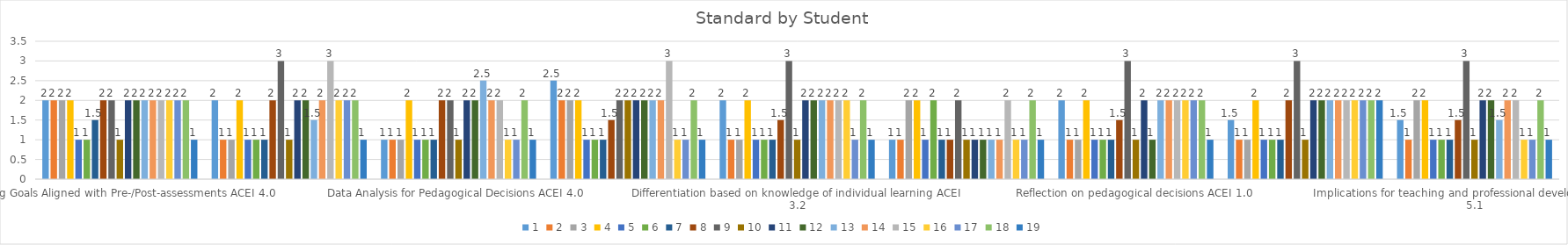
| Category | 1 | 2 | 3 | 4 | 5 | 6 | 7 | 8 | 9 | 10 | 11 | 12 | 13 | 14 | 15 | 16 | 17 | 18 | 19 |
|---|---|---|---|---|---|---|---|---|---|---|---|---|---|---|---|---|---|---|---|
| Learning Goals Aligned with Pre-/Post-assessments ACEI 4.0 | 2 | 2 | 2 | 2 | 1 | 1 | 1.5 | 2 | 2 | 1 | 2 | 2 | 2 | 2 | 2 | 2 | 2 | 2 | 1 |
| Data Points | 2 | 1 | 1 | 2 | 1 | 1 | 1 | 2 | 3 | 1 | 2 | 2 | 1.5 | 2 | 3 | 2 | 2 | 2 | 1 |
| Data Analysis for Pedagogical Decisions ACEI 4.0 | 1 | 1 | 1 | 2 | 1 | 1 | 1 | 2 | 2 | 1 | 2 | 2 | 2.5 | 2 | 2 | 1 | 1 | 2 | 1 |
| Integrated Instruction ACEI 3.1 | 2.5 | 2 | 2 | 2 | 1 | 1 | 1 | 1.5 | 2 | 2 | 2 | 2 | 2 | 2 | 3 | 1 | 1 | 2 | 1 |
| Differentiation based on knowledge of individual learning ACEI 3.2 | 2 | 1 | 1 | 2 | 1 | 1 | 1 | 1.5 | 3 | 1 | 2 | 2 | 2 | 2 | 2 | 2 | 1 | 2 | 1 |
| Technology integration | 1 | 1 | 2 | 2 | 1 | 2 | 1 | 1 | 2 | 1 | 1 | 1 | 1 | 1 | 2 | 1 | 1 | 2 | 1 |
| Reflection on pedagogical decisions ACEI 1.0 | 2 | 1 | 1 | 2 | 1 | 1 | 1 | 1.5 | 3 | 1 | 2 | 1 | 2 | 2 | 2 | 2 | 2 | 2 | 1 |
| Evidence of impact on student learning ACEI 5.1 | 1.5 | 1 | 1 | 2 | 1 | 1 | 1 | 2 | 3 | 1 | 2 | 2 | 2 | 2 | 2 | 2 | 2 | 2 | 2 |
| Implications for teaching and professional development ACEI 5.1 | 1.5 | 1 | 2 | 2 | 1 | 1 | 1 | 1.5 | 3 | 1 | 2 | 2 | 1.5 | 2 | 2 | 1 | 1 | 2 | 1 |